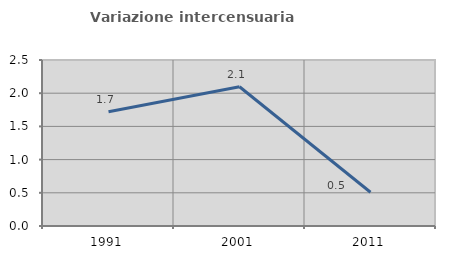
| Category | Variazione intercensuaria annua |
|---|---|
| 1991.0 | 1.72 |
| 2001.0 | 2.097 |
| 2011.0 | 0.508 |